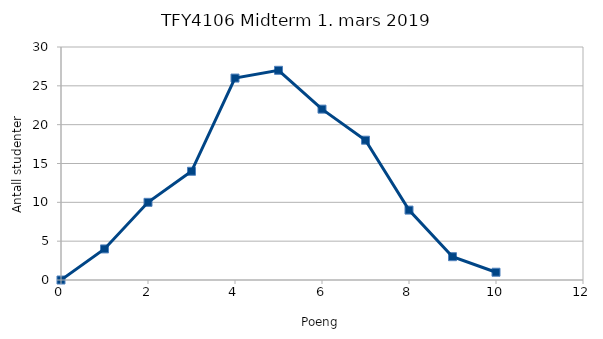
| Category | Series 0 |
|---|---|
| 0.0 | 0 |
| 1.0 | 4 |
| 2.0 | 10 |
| 3.0 | 14 |
| 4.0 | 26 |
| 5.0 | 27 |
| 6.0 | 22 |
| 7.0 | 18 |
| 8.0 | 9 |
| 9.0 | 3 |
| 10.0 | 1 |